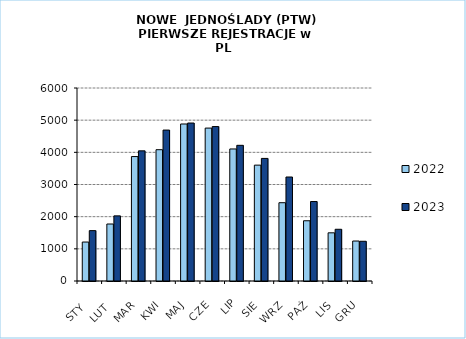
| Category | 2022 | 2023 |
|---|---|---|
|  STY  | 1211 | 1566 |
|  LUT  | 1772 | 2025 |
| MAR | 3869 | 4046 |
| KWI | 4082 | 4692 |
| MAJ | 4881 | 4911 |
| CZE | 4754 | 4801 |
| LIP | 4105 | 4218 |
| SIE | 3602 | 3811 |
| WRZ | 2434 | 3233 |
| PAŹ | 1873 | 2471 |
| LIS | 1498 | 1608 |
| GRU | 1243 | 1235 |